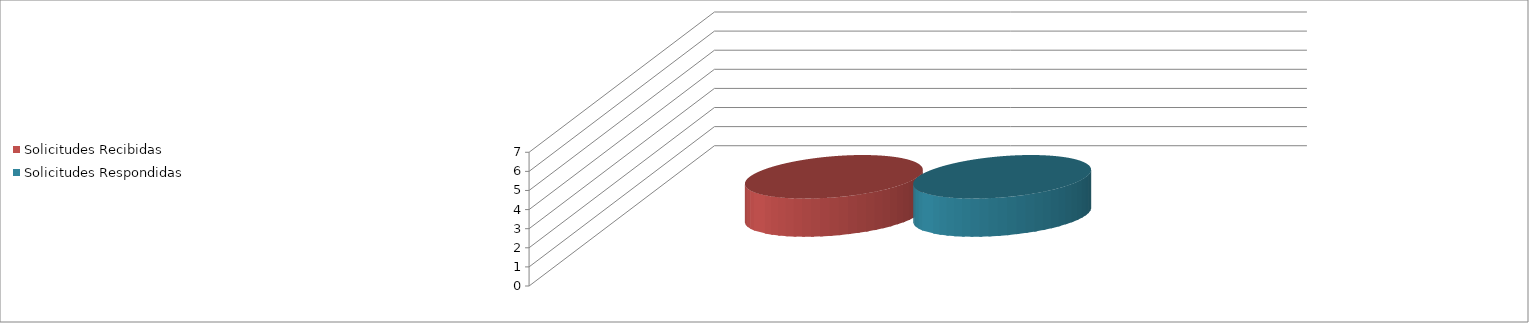
| Category | Solicitudes Recibidas | Solicitudes Respondidas |
|---|---|---|
| 0 | 2 | 2 |